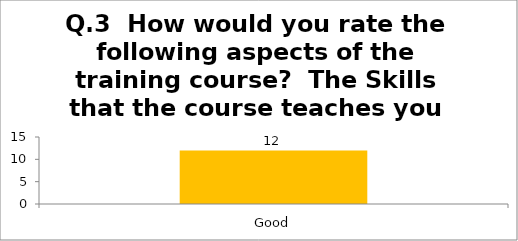
| Category | Q.3  How would you rate the following aspects of the training course?  The Skills that the course teaches you |
|---|---|
| Good | 12 |